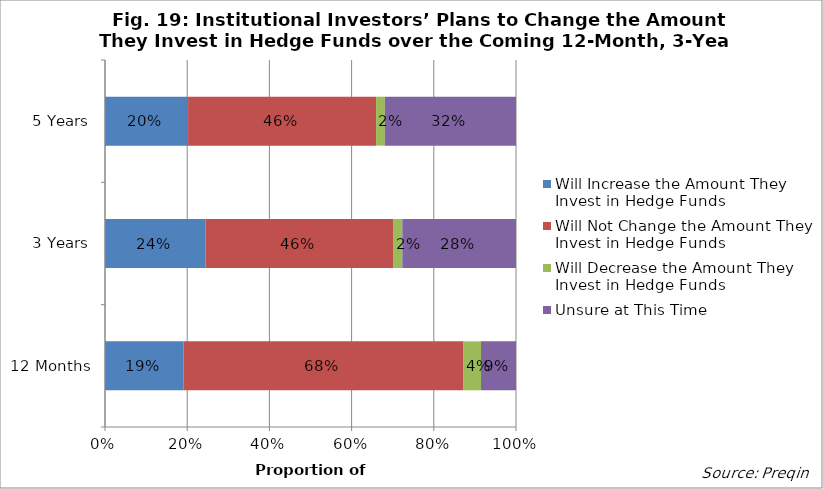
| Category | Will Increase the Amount They Invest in Hedge Funds | Will Not Change the Amount They Invest in Hedge Funds | Will Decrease the Amount They Invest in Hedge Funds | Unsure at This Time |
|---|---|---|---|---|
| 12 Months | 0.191 | 0.681 | 0.043 | 0.085 |
| 3 Years | 0.245 | 0.457 | 0.021 | 0.277 |
| 5 Years | 0.202 | 0.457 | 0.021 | 0.319 |